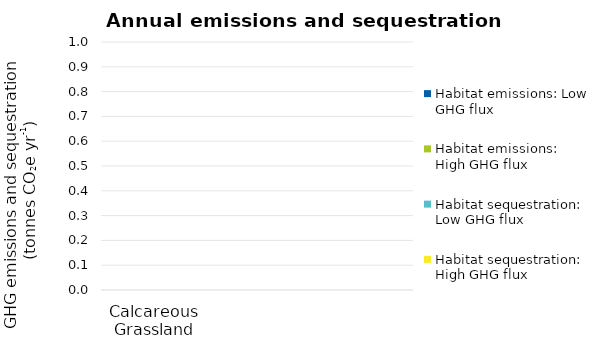
| Category | Habitat emissions: | Habitat sequestration: |
|---|---|---|
| Calcareous Grassland | 0 | 0 |
|   | 0 | 0 |
|   | 0 | 0 |